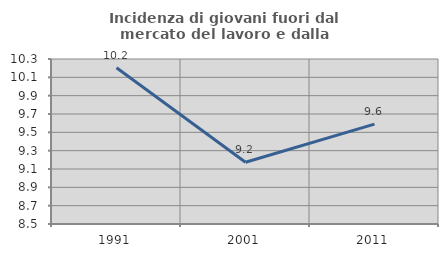
| Category | Incidenza di giovani fuori dal mercato del lavoro e dalla formazione  |
|---|---|
| 1991.0 | 10.204 |
| 2001.0 | 9.174 |
| 2011.0 | 9.589 |